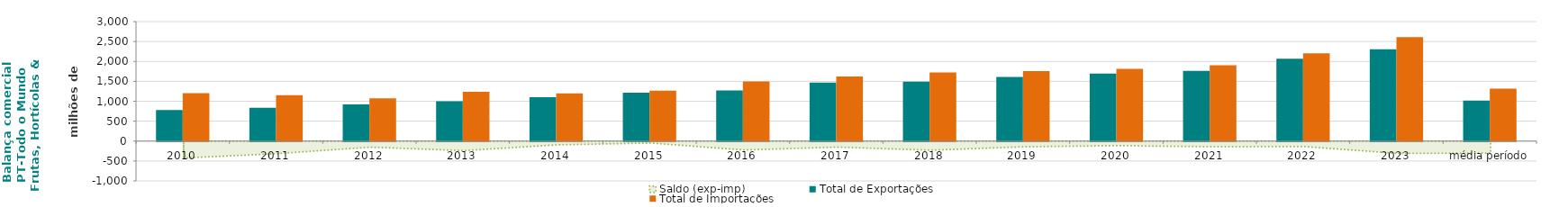
| Category | Total de Exportações  | Total de Importações  |
|---|---|---|
| 2010 | 780.307 | 1206.18 |
| 2011 | 836.622 | 1152.087 |
| 2012 | 920.934 | 1073.394 |
| 2013 | 999.936 | 1238.777 |
| 2014 | 1101.402 | 1196.038 |
| 2015 | 1213.991 | 1263.516 |
| 2016 | 1273.454 | 1496.085 |
| 2017 | 1469.71 | 1621.929 |
| 2018 | 1492.933 | 1721.854 |
| 2019 | 1612.206 | 1755.978 |
| 2020 | 1696.139 | 1811.314 |
| 2021 | 1763.796 | 1906.289 |
| 2022 | 2068.151 | 2205.529 |
| 2023 | 2303.158 | 2611.548 |
| média período | 1015.51 | 1318.306 |